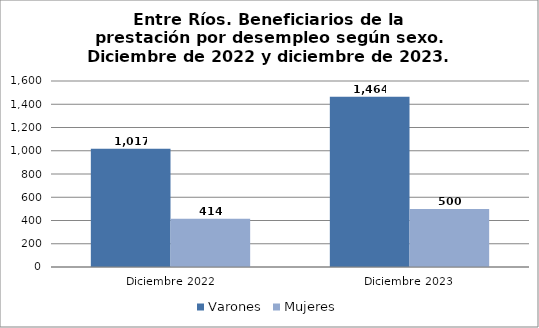
| Category | Varones | Mujeres |
|---|---|---|
| Diciembre 2022 | 1017 | 414 |
| Diciembre 2023 | 1464 | 500 |